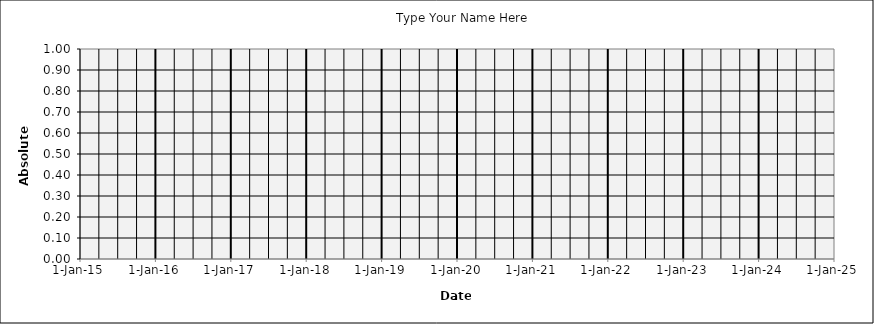
| Category | Type Your Name Here |
|---|---|
|  | 0 |
|  | 0 |
|  | 0 |
|  | 0 |
|  | 0 |
|  | 0 |
|  | 0 |
|  | 0 |
|  | 0 |
|  | 0 |
|  | 0 |
|  | 0 |
|  | 0 |
|  | 0 |
|  | 0 |
|  | 0 |
|  | 0 |
|  | 0 |
|  | 0 |
|  | 0 |
|  | 0 |
|  | 0 |
|  | 0 |
|  | 0 |
|  | 0 |
|  | 0 |
|  | 0 |
|  | 0 |
|  | 0 |
|  | 0 |
|  | 0 |
|  | 0 |
|  | 0 |
|  | 0 |
|  | 0 |
|  | 0 |
|  | 0 |
|  | 0 |
|  | 0 |
|  | 0 |
|  | 0 |
|  | 0 |
|  | 0 |
|  | 0 |
|  | 0 |
|  | 0 |
|  | 0 |
|  | 0 |
|  | 0 |
|  | 0 |
|  | 0 |
|  | 0 |
|  | 0 |
|  | 0 |
|  | 0 |
|  | 0 |
|  | 0 |
|  | 0 |
|  | 0 |
|  | 0 |
|  | 0 |
|  | 0 |
|  | 0 |
|  | 0 |
|  | 0 |
|  | 0 |
|  | 0 |
|  | 0 |
|  | 0 |
|  | 0 |
|  | 0 |
|  | 0 |
|  | 0 |
|  | 0 |
|  | 0 |
|  | 0 |
|  | 0 |
|  | 0 |
|  | 0 |
|  | 0 |
|  | 0 |
|  | 0 |
|  | 0 |
|  | 0 |
|  | 0 |
|  | 0 |
|  | 0 |
|  | 0 |
|  | 0 |
|  | 0 |
|  | 0 |
|  | 0 |
|  | 0 |
|  | 0 |
|  | 0 |
|  | 0 |
|  | 0 |